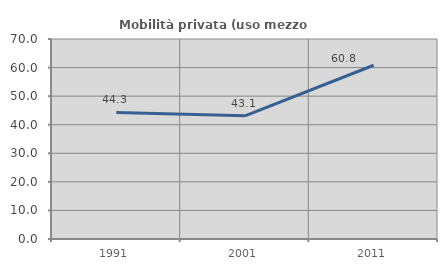
| Category | Mobilità privata (uso mezzo privato) |
|---|---|
| 1991.0 | 44.293 |
| 2001.0 | 43.098 |
| 2011.0 | 60.808 |